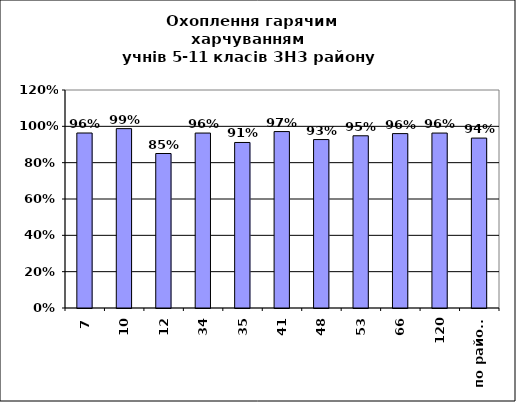
| Category | 105 312 432 390 318 101 242 693 240 130 2963 |
|---|---|
| 7 | 0.963 |
| 10 | 0.987 |
| 12 | 0.85 |
| 34 | 0.963 |
| 35 | 0.911 |
| 41 | 0.971 |
| 48 | 0.927 |
| 53 | 0.948 |
| 66 | 0.96 |
| 120 | 0.963 |
| по району | 0.935 |